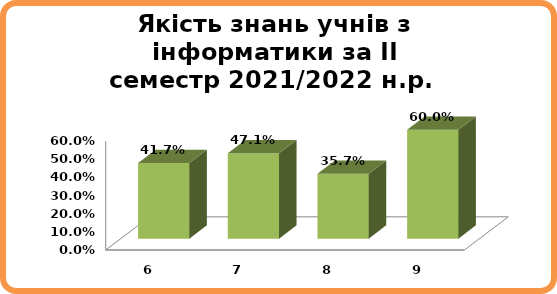
| Category | Series 0 |
|---|---|
| 6.0 | 0.417 |
| 7.0 | 0.471 |
| 8.0 | 0.357 |
| 9.0 | 0.6 |